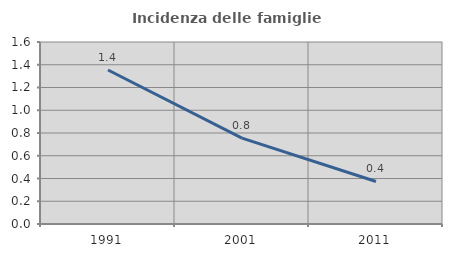
| Category | Incidenza delle famiglie numerose |
|---|---|
| 1991.0 | 1.354 |
| 2001.0 | 0.755 |
| 2011.0 | 0.374 |